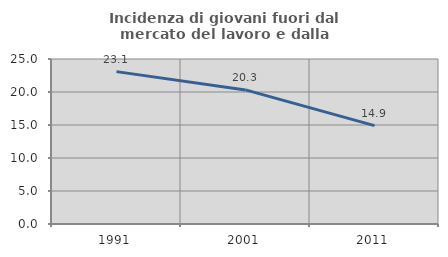
| Category | Incidenza di giovani fuori dal mercato del lavoro e dalla formazione  |
|---|---|
| 1991.0 | 23.088 |
| 2001.0 | 20.317 |
| 2011.0 | 14.912 |